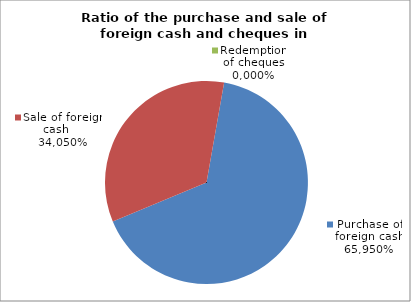
| Category | Purchase of foreign cash |
|---|---|
| 0 | 0.66 |
| 1 | 0.34 |
| 2 | 0 |